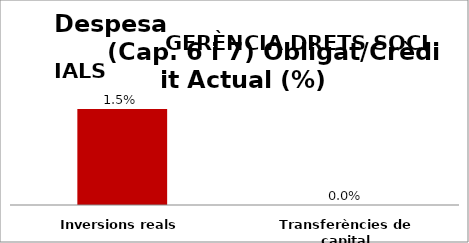
| Category | Series 0 |
|---|---|
| Inversions reals | 0.015 |
| Transferències de capital | 0 |